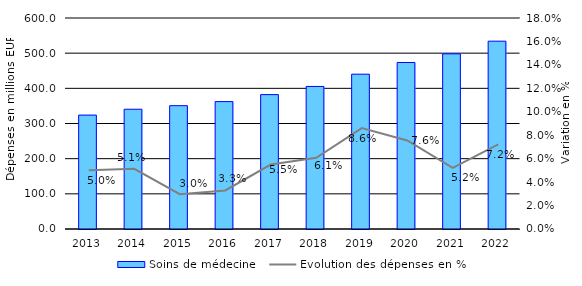
| Category | Soins de médecine  |
|---|---|
| 2013.0 | 323.943 |
| 2014.0 | 340.57 |
| 2015.0 | 350.691 |
| 2016.0 | 362.223 |
| 2017.0 | 382.138 |
| 2018.0 | 405.363 |
| 2019.0 | 440.24 |
| 2020.0 | 473.506 |
| 2021.0 | 498.155 |
| 2022.0 | 534.1 |